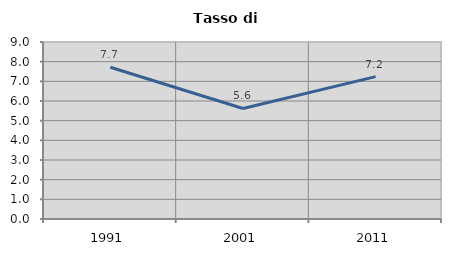
| Category | Tasso di disoccupazione   |
|---|---|
| 1991.0 | 7.718 |
| 2001.0 | 5.62 |
| 2011.0 | 7.238 |